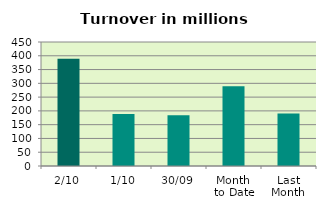
| Category | Series 0 |
|---|---|
| 2/10 | 389.415 |
| 1/10 | 189.087 |
| 30/09 | 184.283 |
| Month 
to Date | 289.251 |
| Last
Month | 190.73 |